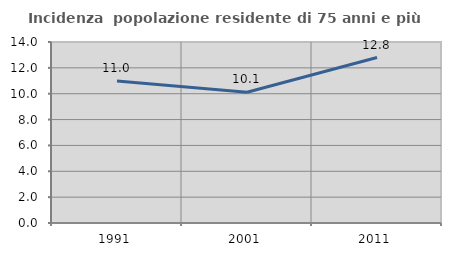
| Category | Incidenza  popolazione residente di 75 anni e più |
|---|---|
| 1991.0 | 10.992 |
| 2001.0 | 10.117 |
| 2011.0 | 12.8 |